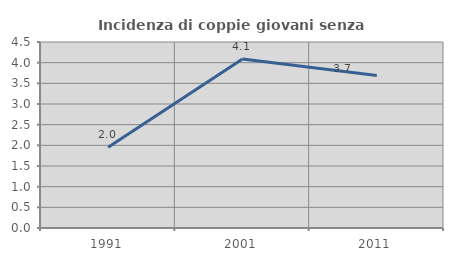
| Category | Incidenza di coppie giovani senza figli |
|---|---|
| 1991.0 | 1.951 |
| 2001.0 | 4.091 |
| 2011.0 | 3.689 |